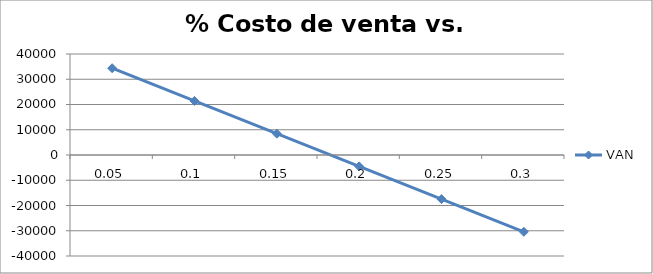
| Category | VAN |
|---|---|
| 0.05 | 34369.848 |
| 0.1 | 21410.247 |
| 0.15 | 8450.646 |
| 0.2 | -4508.955 |
| 0.25 | -17468.557 |
| 0.3 | -30428.158 |